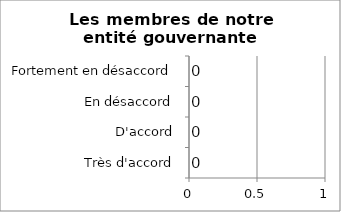
| Category | A |
|---|---|
| Très d'accord | 0 |
| D'accord | 0 |
| En désaccord | 0 |
| Fortement en désaccord | 0 |